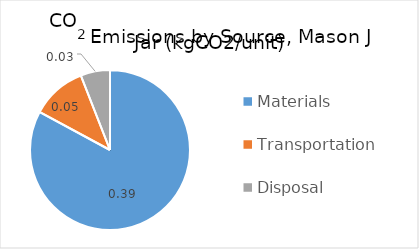
| Category | Series 0 |
|---|---|
| Materials | 0.388 |
| Transportation | 0.052 |
| Disposal | 0.028 |